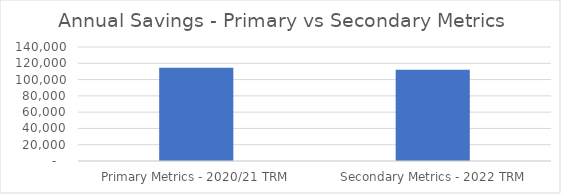
| Category | Series 0 |
|---|---|
|  Primary Metrics - 2020/21 TRM  | 114558.282 |
|  Secondary Metrics - 2022 TRM  | 112199.29 |